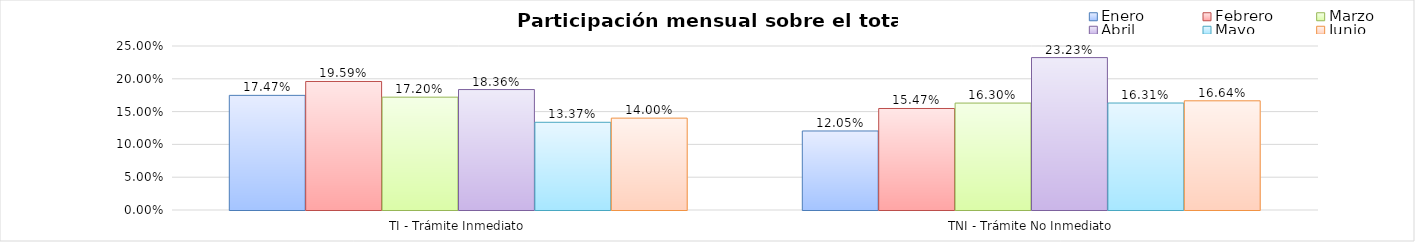
| Category | Enero | Febrero | Marzo | Abril | Mayo | Junio |
|---|---|---|---|---|---|---|
| TI - Trámite Inmediato | 0.175 | 0.196 | 0.172 | 0.184 | 0.134 | 0.14 |
| TNI - Trámite No Inmediato | 0.12 | 0.155 | 0.163 | 0.232 | 0.163 | 0.166 |